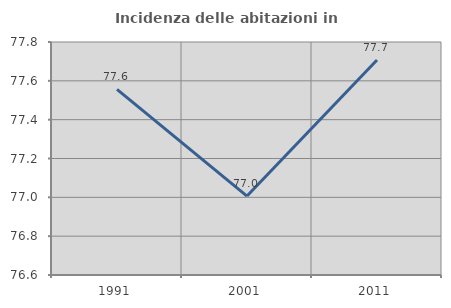
| Category | Incidenza delle abitazioni in proprietà  |
|---|---|
| 1991.0 | 77.556 |
| 2001.0 | 77.007 |
| 2011.0 | 77.707 |